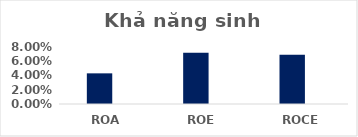
| Category | Series 0 | Series 1 | Series 2 | Series 3 |
|---|---|---|---|---|
| ROA | 0.043 |  |  |  |
| ROE | 0.072 |  |  |  |
| ROCE | 0.069 |  |  |  |